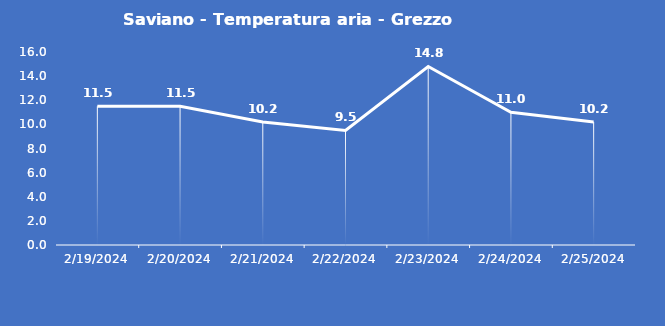
| Category | Saviano - Temperatura aria - Grezzo (°C) |
|---|---|
| 2/19/24 | 11.5 |
| 2/20/24 | 11.5 |
| 2/21/24 | 10.2 |
| 2/22/24 | 9.5 |
| 2/23/24 | 14.8 |
| 2/24/24 | 11 |
| 2/25/24 | 10.2 |